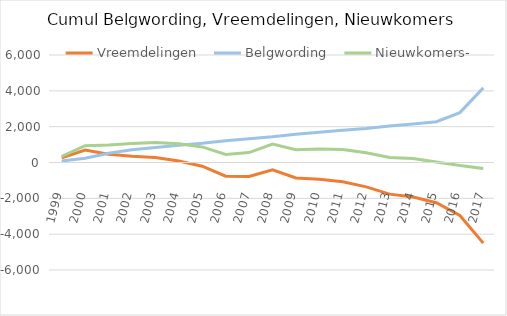
| Category | Vreemdelingen | Belgwording | Nieuwkomers- |
|---|---|---|---|
| 1999.0 | 254 | 87 | 341 |
| 2000.0 | 698 | 239 | 937 |
| 2001.0 | 461 | 513 | 974 |
| 2002.0 | 345 | 714 | 1059 |
| 2003.0 | 281 | 840 | 1121 |
| 2004.0 | 80 | 968 | 1048 |
| 2005.0 | -205 | 1074 | 869 |
| 2006.0 | -763 | 1215 | 452 |
| 2007.0 | -776 | 1329 | 553 |
| 2008.0 | -407 | 1433 | 1026 |
| 2009.0 | -862 | 1576 | 714 |
| 2010.0 | -931 | 1687 | 756 |
| 2011.0 | -1077 | 1801 | 724 |
| 2012.0 | -1359 | 1900 | 541 |
| 2013.0 | -1765 | 2041 | 276 |
| 2014.0 | -1928 | 2151 | 223 |
| 2015.0 | -2244 | 2278 | 34 |
| 2016.0 | -2953 | 2784 | -169 |
| 2017.0 | -4499 | 4165 | -334 |